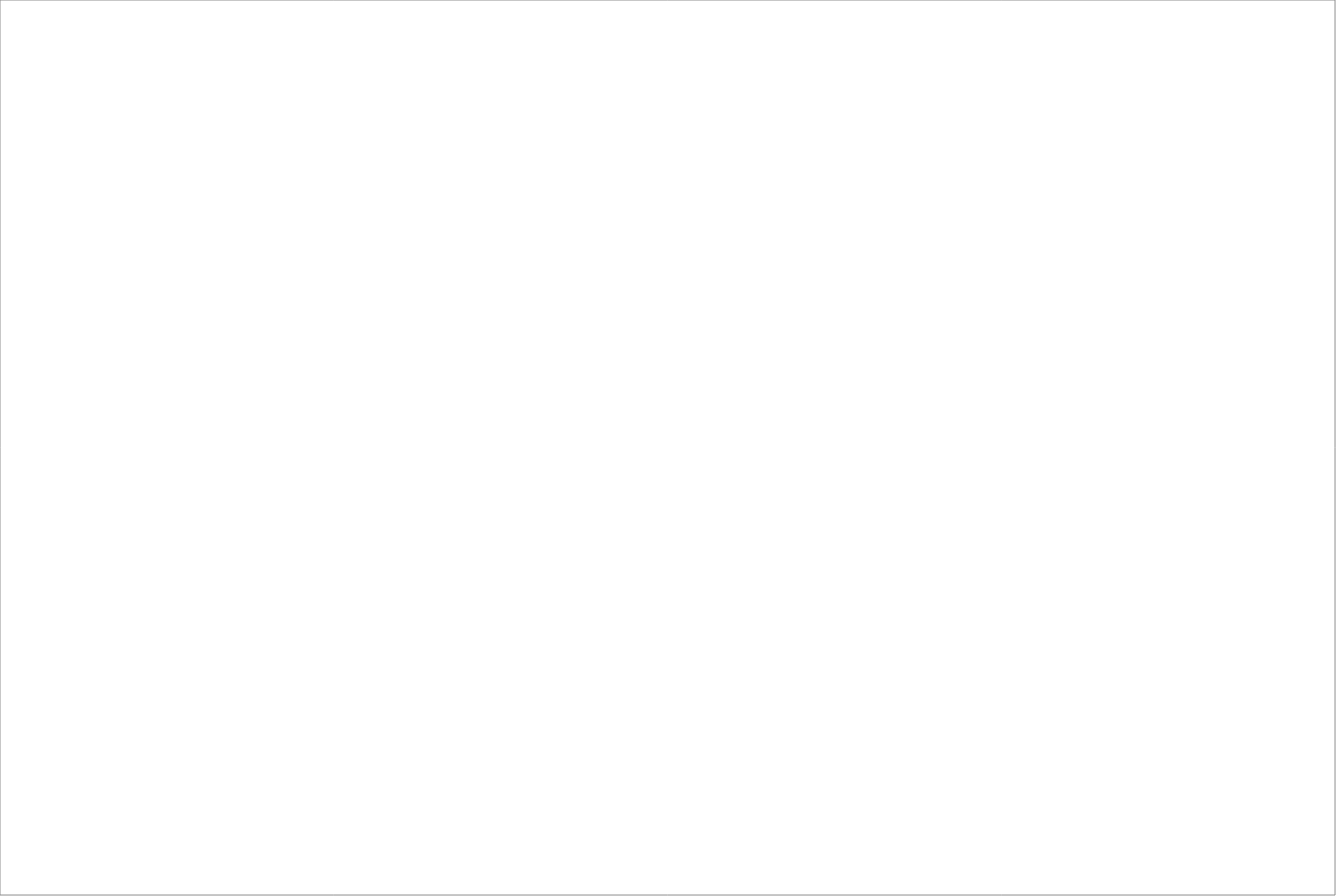
| Category | Total |
|---|---|
| Randstad AB | 77.5 |
| StudentConsulting Sweden AB | 65 |
| Poolia Sverige AB | 65 |
| Academic Work Sweden AB  | 62.5 |
| Experis AB | 62.5 |